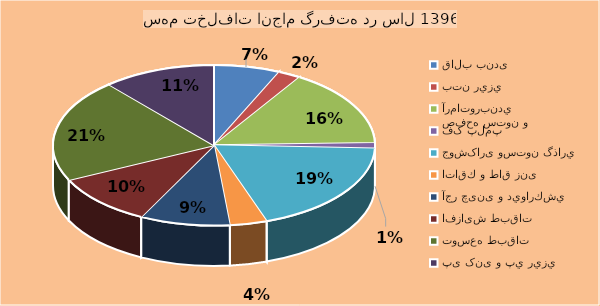
| Category | Series 0 |
|---|---|
| قالب بندی | 200 |
| بتن ريزي | 68 |
| صفحه ستون و آرماتوربندي | 469 |
| فک پلمپ | 33 |
| جوشکاری وستون گذاري  | 573 |
| اتاقك و طاق زنی | 112 |
| آجر چینی و ديواركشي  | 271 |
| افزایش طبقات | 313 |
| توسعه طبقات | 625 |
| پی کنی و پي ريزي  | 340 |